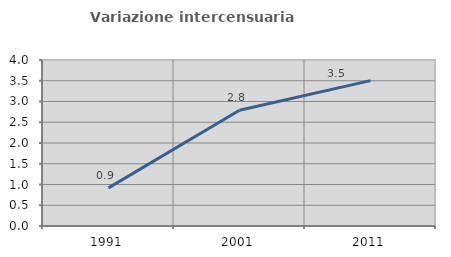
| Category | Variazione intercensuaria annua |
|---|---|
| 1991.0 | 0.918 |
| 2001.0 | 2.788 |
| 2011.0 | 3.503 |